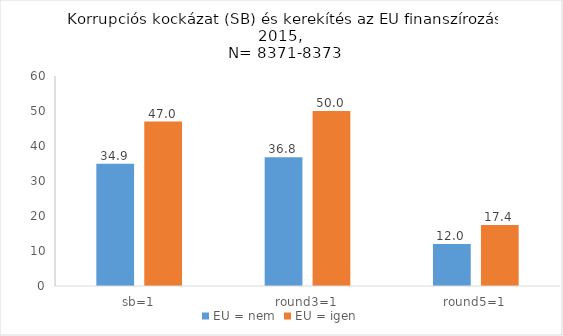
| Category | EU = nem | EU = igen |
|---|---|---|
| sb=1 | 34.9 | 47 |
| round3=1 | 36.8 | 50 |
| round5=1 | 12 | 17.4 |